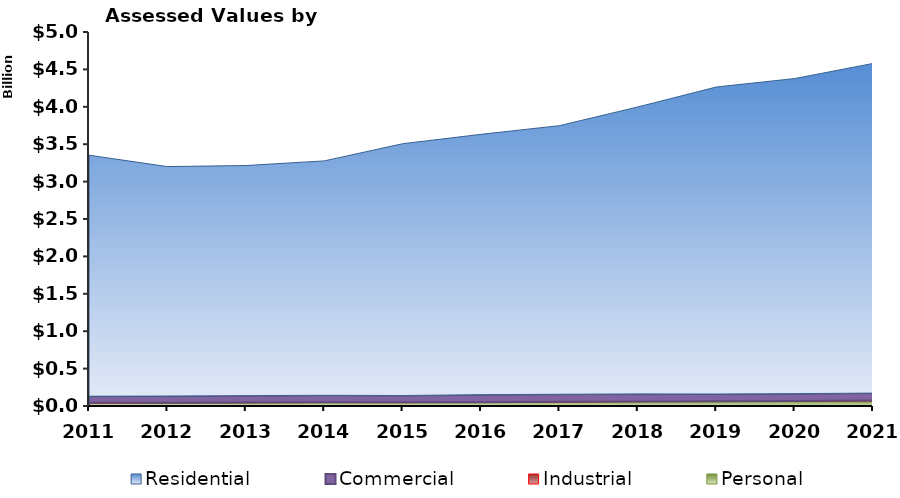
| Category | Personal | Industrial | Commercial | Residential |
|---|---|---|---|---|
| 2011.0 | 40395200 | 2319500 | 87896029 | 3222272471 |
| 2012.0 | 41683140 | 2844400 | 88685699 | 3067422072 |
| 2013.0 | 43585780 | 2735800 | 92204500 | 3076141600 |
| 2014.0 | 45889560 | 2779800 | 94583642 | 3133284628 |
| 2015.0 | 44938420 | 4128976 | 90881004 | 3366472285 |
| 2016.0 | 48372550 | 3009900 | 100122228 | 3480420057 |
| 2017.0 | 52872380 | 3009900 | 100882281 | 3590943268 |
| 2018.0 | 58670190 | 2635000 | 100091785 | 3836620986 |
| 2019.0 | 59437570 | 2729500 | 97997347 | 4103920658 |
| 2020.0 | 63767560 | 2739600 | 98849480 | 4212300181 |
| 2021.0 | 69783770 | 2739100 | 99763089 | 4407492535 |